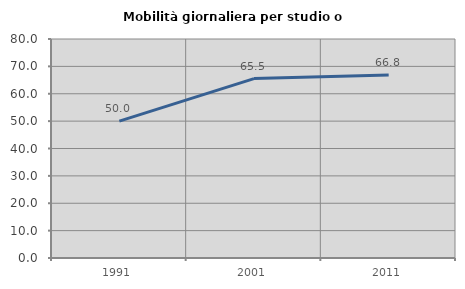
| Category | Mobilità giornaliera per studio o lavoro |
|---|---|
| 1991.0 | 50 |
| 2001.0 | 65.534 |
| 2011.0 | 66.816 |